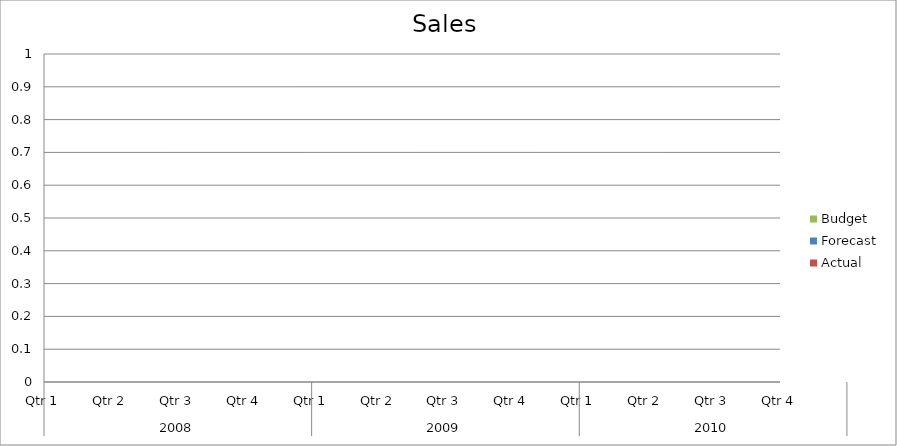
| Category | Budget | Forecast | Actual |
|---|---|---|---|
| 0 | 2580 | 2580 | 1200 |
| 1 | 2750 | 2920 | 870 |
| 2 | 1320 | 1880 | 2310 |
| 3 | 1000 | 910 | 1660 |
| 4 | 1760 | 3360 | 3110 |
| 5 | 2740 | 2220 | 2030 |
| 6 | 1380 | 3180 | 1910 |
| 7 | 2660 | 1950 | 2510 |
| 8 | 1140 | 2000 | 2610 |
| 9 | 1610 | 1870 | 1360 |
| 10 | 3170 | 2270 | 830 |
| 11 | 3090 | 2760 | 2940 |